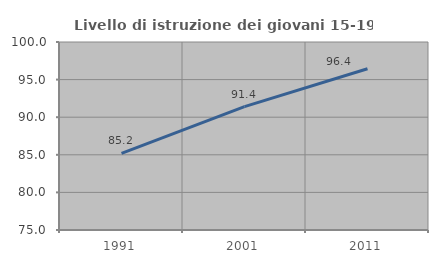
| Category | Livello di istruzione dei giovani 15-19 anni |
|---|---|
| 1991.0 | 85.18 |
| 2001.0 | 91.408 |
| 2011.0 | 96.437 |